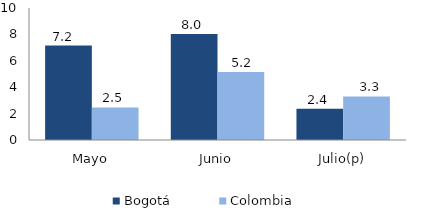
| Category | Bogotá | Colombia |
|---|---|---|
| Mayo | 7.155 | 2.467 |
| Junio | 8.039 | 5.151 |
| Julio(p) | 2.362 | 3.302 |